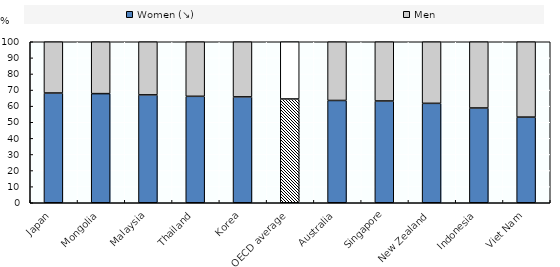
| Category | Women (↘) | Men |
|---|---|---|
| Japan | 68.162 | 31.838 |
| Mongolia | 67.78 | 32.22 |
| Malaysia | 67 | 33 |
| Thailand | 66.116 | 33.884 |
| Korea | 65.759 | 34.241 |
| OECD average | 64.461 | 35.539 |
| Australia | 63.531 | 36.469 |
| Singapore | 63.217 | 36.783 |
| New Zealand | 61.748 | 38.252 |
| Indonesia | 58.857 | 41.143 |
| Viet Nam | 53.2 | 46.8 |